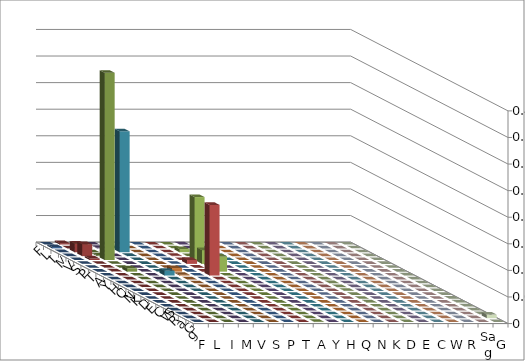
| Category | F | L | I | M | V | S | P | T | A | Y | H | Q | N | K | D | E | C | W | R | Sag | G |
|---|---|---|---|---|---|---|---|---|---|---|---|---|---|---|---|---|---|---|---|---|---|
| F | 0 | 0.003 | 0 | 0 | 0 | 0 | 0 | 0 | 0 | 0 | 0 | 0 | 0 | 0 | 0 | 0 | 0 | 0 | 0 | 0 | 0 |
| L | 0.003 | 0 | 0.003 | 0.001 | 0 | 0 | 0 | 0 | 0 | 0 | 0 | 0 | 0 | 0 | 0 | 0 | 0 | 0 | 0 | 0 | 0 |
| I | 0 | 0.016 | 0 | 0 | 0.227 | 0 | 0 | 0 | 0.006 | 0 | 0 | 0 | 0 | 0 | 0 | 0 | 0 | 0 | 0 | 0 | 0 |
| M | 0 | 0.023 | 0.002 | 0 | 0 | 0 | 0 | 0.001 | 0 | 0 | 0 | 0 | 0 | 0 | 0 | 0 | 0 | 0 | 0 | 0 | 0 |
| V | 0 | 0.003 | 0.352 | 0 | 0 | 0 | 0 | 0 | 0.118 | 0 | 0 | 0 | 0 | 0 | 0 | 0 | 0 | 0 | 0 | 0 | 0 |
| S | 0 | 0 | 0 | 0 | 0 | 0 | 0 | 0.008 | 0.026 | 0 | 0 | 0 | 0 | 0 | 0 | 0 | 0 | 0 | 0 | 0 | 0 |
| P | 0 | 0.001 | 0 | 0 | 0 | 0 | 0 | 0 | 0.003 | 0 | 0 | 0 | 0 | 0 | 0 | 0 | 0 | 0 | 0 | 0 | 0 |
| T | 0 | 0.001 | 0.006 | 0 | 0 | 0.007 | 0 | 0 | 0.029 | 0 | 0 | 0 | 0 | 0 | 0 | 0 | 0 | 0 | 0 | 0 | 0 |
| A | 0 | 0 | 0 | 0 | 0.009 | 0.002 | 0 | 0.133 | 0 | 0 | 0 | 0 | 0 | 0 | 0 | 0 | 0 | 0 | 0 | 0 | 0 |
| Y | 0 | 0 | 0 | 0 | 0 | 0 | 0 | 0 | 0 | 0 | 0 | 0 | 0 | 0 | 0 | 0 | 0 | 0 | 0 | 0 | 0 |
| H | 0 | 0 | 0 | 0 | 0 | 0 | 0 | 0 | 0 | 0 | 0 | 0 | 0 | 0 | 0 | 0 | 0 | 0 | 0 | 0 | 0 |
| Q | 0 | 0 | 0 | 0 | 0 | 0 | 0 | 0 | 0 | 0 | 0 | 0 | 0 | 0 | 0 | 0 | 0 | 0 | 0 | 0 | 0 |
| N | 0 | 0 | 0 | 0 | 0 | 0 | 0 | 0 | 0 | 0 | 0 | 0 | 0 | 0 | 0 | 0 | 0 | 0 | 0 | 0 | 0 |
| K | 0 | 0 | 0 | 0 | 0 | 0 | 0 | 0 | 0 | 0 | 0 | 0 | 0 | 0 | 0 | 0 | 0 | 0 | 0 | 0 | 0 |
| D | 0 | 0 | 0 | 0 | 0 | 0 | 0 | 0 | 0 | 0 | 0 | 0 | 0 | 0 | 0 | 0 | 0 | 0 | 0 | 0 | 0 |
| E | 0 | 0 | 0 | 0 | 0 | 0 | 0 | 0 | 0 | 0 | 0 | 0 | 0 | 0 | 0.001 | 0 | 0 | 0 | 0 | 0 | 0.001 |
| C | 0 | 0 | 0 | 0 | 0 | 0 | 0 | 0 | 0 | 0 | 0 | 0 | 0 | 0 | 0 | 0 | 0 | 0 | 0 | 0 | 0 |
| W | 0 | 0 | 0 | 0 | 0 | 0 | 0 | 0 | 0 | 0 | 0 | 0 | 0 | 0 | 0 | 0 | 0 | 0 | 0 | 0 | 0 |
| R | 0 | 0 | 0 | 0 | 0 | 0 | 0 | 0 | 0 | 0 | 0 | 0 | 0 | 0 | 0 | 0 | 0 | 0 | 0 | 0 | 0 |
| Sag | 0 | 0 | 0 | 0 | 0 | 0 | 0 | 0 | 0 | 0 | 0 | 0 | 0 | 0 | 0 | 0 | 0 | 0 | 0 | 0 | 0.007 |
| G | 0 | 0 | 0 | 0 | 0 | 0 | 0 | 0 | 0 | 0 | 0 | 0 | 0 | 0 | 0 | 0 | 0 | 0 | 0 | 0 | 0 |